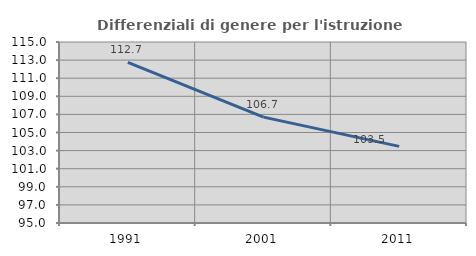
| Category | Differenziali di genere per l'istruzione superiore |
|---|---|
| 1991.0 | 112.746 |
| 2001.0 | 106.696 |
| 2011.0 | 103.47 |